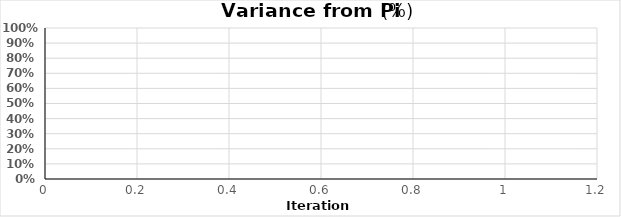
| Category | i |
|---|---|
| 1.0 | 0 |